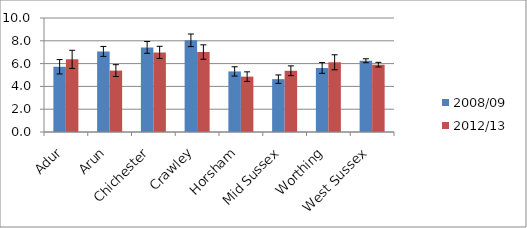
| Category | 2008/09 | 2012/13 |
|---|---|---|
| Adur | 5.723 | 6.375 |
| Arun | 7.069 | 5.387 |
| Chichester | 7.421 | 6.983 |
| Crawley | 8.043 | 7.015 |
| Horsham | 5.314 | 4.858 |
| Mid Sussex | 4.637 | 5.371 |
| Worthing | 5.619 | 6.114 |
| West Sussex | 6.25 | 5.908 |